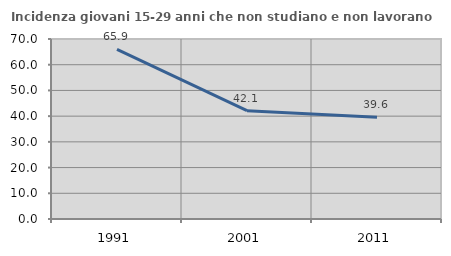
| Category | Incidenza giovani 15-29 anni che non studiano e non lavorano  |
|---|---|
| 1991.0 | 65.94 |
| 2001.0 | 42.105 |
| 2011.0 | 39.583 |